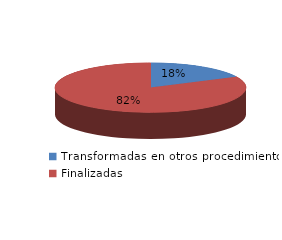
| Category | Series 0 |
|---|---|
| Transformadas en otros procedimientos | 5401 |
| Finalizadas | 25168 |